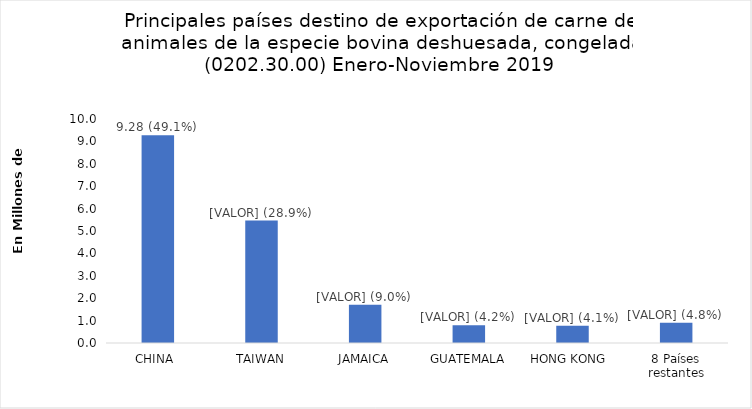
| Category | Series 0 |
|---|---|
| CHINA  | 9279801 |
| TAIWAN | 5464065 |
| JAMAICA | 1706630 |
| GUATEMALA | 796288 |
| HONG KONG  | 768974 |
| 8 Países restantes | 901380 |